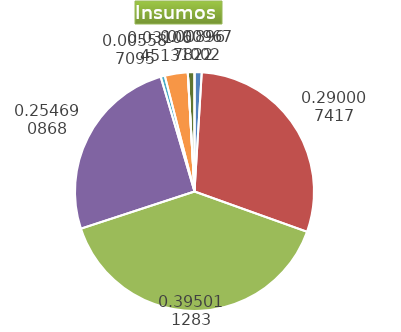
| Category | Series 0 |
|---|---|
| Control arvenses | 834960 |
| Control fitosanitario | 25469895 |
| Cosecha y beneficio | 34103874.377 |
| Fertilización | 21989107 |
| Instalación | 482370 |
| Otros | 2682000 |
| Podas | 0 |
| Riego | 0 |
| Transporte | 774250 |
| Tutorado | 0 |